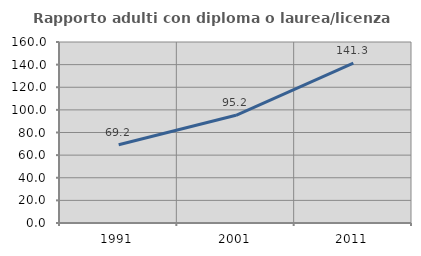
| Category | Rapporto adulti con diploma o laurea/licenza media  |
|---|---|
| 1991.0 | 69.164 |
| 2001.0 | 95.193 |
| 2011.0 | 141.274 |